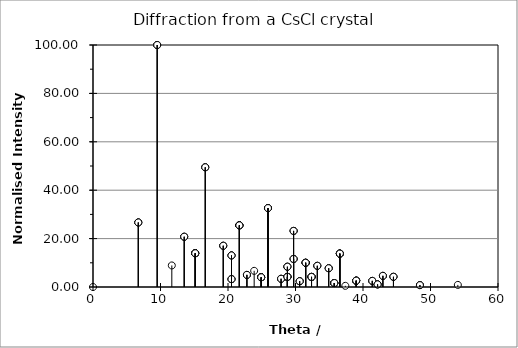
| Category | Series 0 |
|---|---|
| 0.0 | 0 |
| 6.709978439712354 | 26.672 |
| 13.514262431824092 | 20.777 |
| 20.519803470332043 | 3.262 |
| 27.86402428486989 | 3.404 |
| 6.709978439712354 | 26.672 |
| 9.511290053946226 | 100 |
| 15.145460202029952 | 13.938 |
| 21.684305231007333 | 25.484 |
| 28.800343479869195 | 4.193 |
| 13.514262431824092 | 20.777 |
| 15.145460202029952 | 13.938 |
| 19.29814873694832 | 17.053 |
| 24.9158022249994 | 4.015 |
| 31.502846466912494 | 10.017 |
| 20.519803470332043 | 3.262 |
| 21.684305231007333 | 25.484 |
| 24.9158022249994 | 4.015 |
| 29.717624878165697 | 11.59 |
| 35.747800698581095 | 1.629 |
| 27.86402428486989 | 3.404 |
| 28.800343479869195 | 4.193 |
| 31.502846466912494 | 10.017 |
| 35.747800698581095 | 1.629 |
| 41.37372420182965 | 2.534 |
| 6.709978439712354 | 26.672 |
| 9.511290053946226 | 100 |
| 15.145460202029952 | 13.938 |
| 21.684305231007333 | 25.484 |
| 28.800343479869195 | 4.193 |
| 9.511290053946226 | 100 |
| 11.676124485655766 | 8.903 |
| 16.631037253855045 | 49.469 |
| 22.80069201131791 | 5.012 |
| 29.717624878165697 | 23.181 |
| 15.145460202029952 | 13.938 |
| 16.631037253855045 | 49.469 |
| 20.519803470332043 | 13.047 |
| 25.92467190762787 | 32.612 |
| 32.374102817569934 | 4.173 |
| 21.684305231007333 | 25.484 |
| 22.80069201131791 | 5.012 |
| 25.92467190762787 | 32.612 |
| 30.61787290448273 | 2.399 |
| 36.56885003201428 | 13.8 |
| 28.800343479869195 | 4.193 |
| 29.717624878165697 | 23.181 |
| 32.374102817569934 | 4.173 |
| 36.56885003201428 | 13.8 |
| 42.160983402125304 | 1.078 |
| 13.514262431824092 | 20.777 |
| 15.145460202029952 | 13.938 |
| 19.29814873694832 | 17.053 |
| 24.9158022249994 | 4.015 |
| 31.502846466912494 | 10.017 |
| 15.145460202029952 | 13.938 |
| 16.631037253855045 | 49.469 |
| 20.519803470332043 | 13.047 |
| 25.92467190762787 | 32.612 |
| 32.374102817569934 | 4.173 |
| 19.29814873694832 | 17.053 |
| 20.519803470332043 | 13.047 |
| 23.875991815516066 | 6.677 |
| 28.800343479869195 | 8.386 |
| 34.918796472883564 | 7.744 |
| 24.9158022249994 | 4.015 |
| 25.92467190762787 | 32.612 |
| 28.800343479869195 | 8.386 |
| 33.23303217556015 | 8.764 |
| 38.99279027122686 | 2.621 |
| 31.502846466912494 | 10.017 |
| 32.374102817569934 | 4.173 |
| 34.918796472883564 | 7.744 |
| 38.99279027122686 | 2.621 |
| 44.51228794264627 | 4.221 |
| 20.519803470332043 | 3.262 |
| 21.684305231007333 | 25.484 |
| 24.9158022249994 | 4.015 |
| 29.717624878165697 | 11.59 |
| 35.747800698581095 | 1.629 |
| 21.684305231007333 | 25.484 |
| 22.80069201131791 | 5.012 |
| 25.92467190762787 | 32.612 |
| 30.61787290448273 | 2.399 |
| 36.56885003201428 | 13.8 |
| 24.9158022249994 | 4.015 |
| 25.92467190762787 | 32.612 |
| 28.800343479869195 | 8.386 |
| 33.23303217556015 | 8.764 |
| 38.99279027122686 | 2.621 |
| 29.717624878165697 | 11.59 |
| 30.61787290448273 | 2.399 |
| 33.23303217556015 | 8.764 |
| 37.38282570397467 | 0.485 |
| 42.94609677060287 | 4.617 |
| 35.747800698581095 | 1.629 |
| 36.56885003201428 | 13.8 |
| 38.99279027122686 | 2.621 |
| 42.94609677060287 | 4.617 |
| 48.431651462574685 | 0.762 |
| 27.86402428486989 | 3.404 |
| 28.800343479869195 | 4.193 |
| 31.502846466912494 | 10.017 |
| 35.747800698581095 | 1.629 |
| 41.37372420182965 | 2.534 |
| 28.800343479869195 | 4.193 |
| 29.717624878165697 | 23.181 |
| 32.374102817569934 | 4.173 |
| 36.56885003201428 | 13.8 |
| 42.160983402125304 | 1.078 |
| 31.502846466912494 | 10.017 |
| 32.374102817569934 | 4.173 |
| 34.918796472883564 | 7.744 |
| 38.99279027122686 | 2.621 |
| 44.51228794264627 | 4.221 |
| 35.747800698581095 | 1.629 |
| 36.56885003201428 | 13.8 |
| 38.99279027122686 | 2.621 |
| 42.94609677060287 | 4.617 |
| 48.431651462574685 | 0.762 |
| 41.37372420182965 | 2.534 |
| 42.160983402125304 | 1.078 |
| 44.51228794264627 | 4.221 |
| 48.431651462574685 | 0.762 |
| 54.04875978489639 | 0.866 |